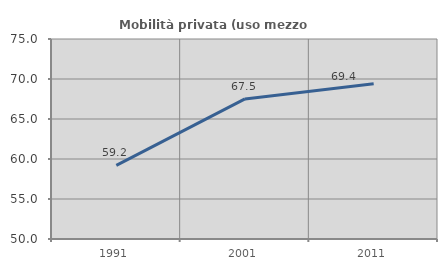
| Category | Mobilità privata (uso mezzo privato) |
|---|---|
| 1991.0 | 59.207 |
| 2001.0 | 67.509 |
| 2011.0 | 69.407 |